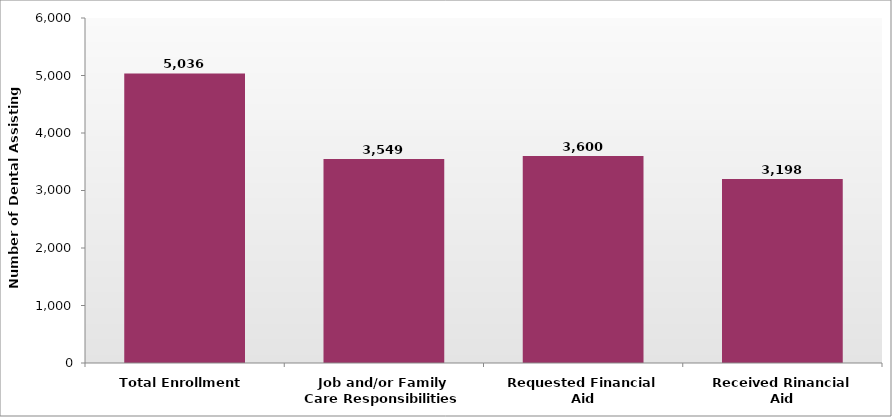
| Category | number of dental assisting students |
|---|---|
| Total Enrollment | 5036 |
| Job and/or Family Care Responsibilities | 3549 |
| Requested Financial Aid | 3600 |
| Received Rinancial Aid | 3198 |